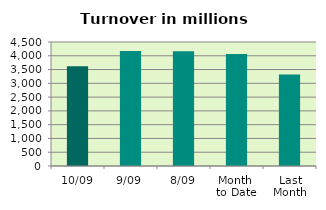
| Category | Series 0 |
|---|---|
| 10/09 | 3618.142 |
| 9/09 | 4175.876 |
| 8/09 | 4163.279 |
| Month 
to Date | 4062.049 |
| Last
Month | 3319.434 |